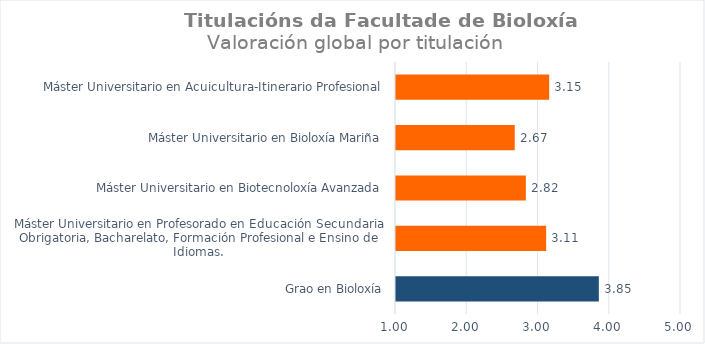
| Category | Series 0 |
|---|---|
| Grao en Bioloxía | 3.847 |
| Máster Universitario en Profesorado en Educación Secundaria Obrigatoria, Bacharelato, Formación Profesional e Ensino de Idiomas.  | 3.107 |
| Máster Universitario en Biotecnoloxía Avanzada | 2.822 |
| Máster Universitario en Bioloxía Mariña | 2.667 |
| Máster Universitario en Acuicultura-Itinerario Profesional | 3.15 |